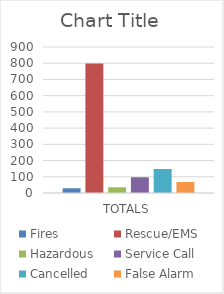
| Category | Fires | Rescue/EMS | Hazardous | Service Call | Cancelled  | False Alarm |
|---|---|---|---|---|---|---|
| TOTALS | 29 | 798 | 35 | 97 | 148 | 68 |